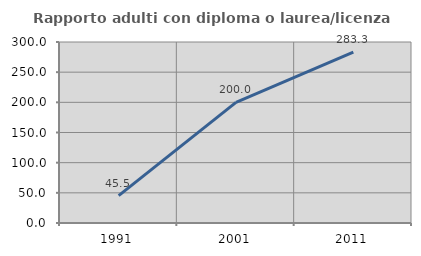
| Category | Rapporto adulti con diploma o laurea/licenza media  |
|---|---|
| 1991.0 | 45.455 |
| 2001.0 | 200 |
| 2011.0 | 283.333 |